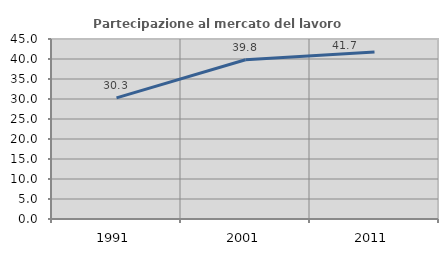
| Category | Partecipazione al mercato del lavoro  femminile |
|---|---|
| 1991.0 | 30.275 |
| 2001.0 | 39.815 |
| 2011.0 | 41.748 |